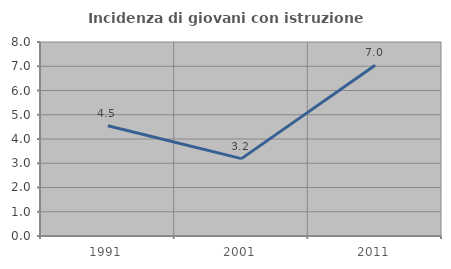
| Category | Incidenza di giovani con istruzione universitaria |
|---|---|
| 1991.0 | 4.545 |
| 2001.0 | 3.191 |
| 2011.0 | 7.042 |